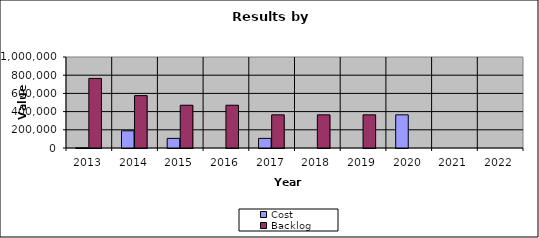
| Category | Cost | Backlog |
|---|---|---|
| 2013.0 | 1258 | 764707 |
| 2014.0 | 189000 | 575707 |
| 2015.0 | 105600 | 470107 |
| 2016.0 | 0 | 470107 |
| 2017.0 | 105600 | 364507 |
| 2018.0 | 0 | 364507 |
| 2019.0 | 0 | 364507 |
| 2020.0 | 364507 | 0 |
| 2021.0 | 0 | 0 |
| 2022.0 | 0 | 0 |